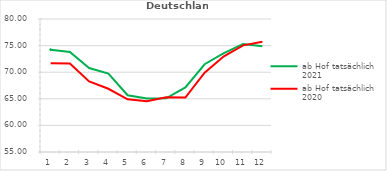
| Category | ab Hof tatsächlich 2021 | ab Hof tatsächlich 2020 |
|---|---|---|
| 0 | 74.23 | 71.671 |
| 1 | 73.819 | 71.627 |
| 2 | 70.79 | 68.274 |
| 3 | 69.753 | 66.886 |
| 4 | 65.676 | 64.91 |
| 5 | 65.061 | 64.538 |
| 6 | 65.096 | 65.277 |
| 7 | 67.125 | 65.243 |
| 8 | 71.496 | 69.895 |
| 9 | 73.584 | 72.99 |
| 10 | 75.299 | 75.05 |
| 11 | 74.895 | 75.724 |